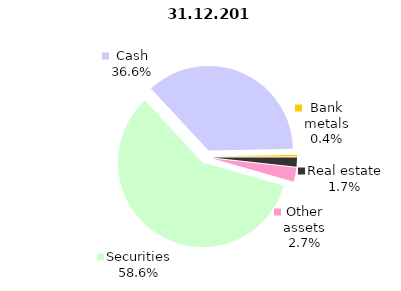
| Category | 31.12.2018 |
|---|---|
| Securities | 1609.6 |
| Cash | 1004 |
| Bank metals | 9.8 |
| Real estate | 47.3 |
| Other assets | 74.5 |